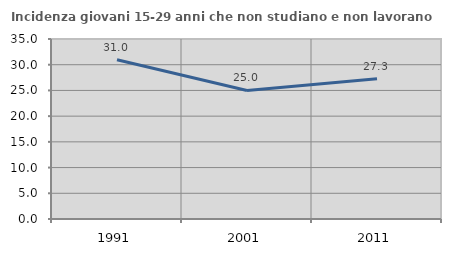
| Category | Incidenza giovani 15-29 anni che non studiano e non lavorano  |
|---|---|
| 1991.0 | 30.952 |
| 2001.0 | 25 |
| 2011.0 | 27.273 |